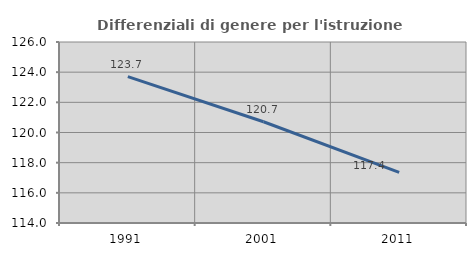
| Category | Differenziali di genere per l'istruzione superiore |
|---|---|
| 1991.0 | 123.703 |
| 2001.0 | 120.713 |
| 2011.0 | 117.361 |